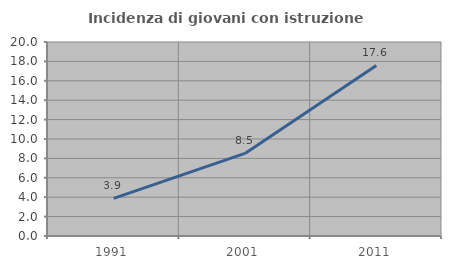
| Category | Incidenza di giovani con istruzione universitaria |
|---|---|
| 1991.0 | 3.876 |
| 2001.0 | 8.511 |
| 2011.0 | 17.582 |